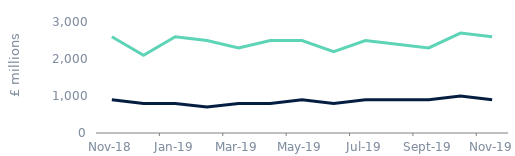
| Category | Remortgage | House purchase |
|---|---|---|
| 2018-11-01 | 900 | 2600 |
| 2018-12-01 | 800 | 2100 |
| 2019-01-01 | 800 | 2600 |
| 2019-02-01 | 700 | 2500 |
| 2019-03-01 | 800 | 2300 |
| 2019-04-01 | 800 | 2500 |
| 2019-05-01 | 900 | 2500 |
| 2019-06-01 | 800 | 2200 |
| 2019-07-01 | 900 | 2500 |
| 2019-08-01 | 900 | 2400 |
| 2019-09-01 | 900 | 2300 |
| 2019-10-01 | 1000 | 2700 |
| 2019-11-01 | 900 | 2600 |